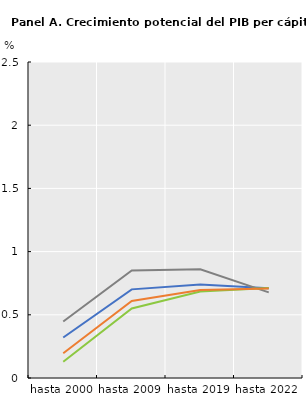
| Category | Media simple | HP | AR(1) | AR(2) |
|---|---|---|---|---|
| hasta 2000 | 0.32 | 0.447 | 0.128 | 0.196 |
| hasta 2009 | 0.701 | 0.851 | 0.55 | 0.61 |
| hasta 2019 | 0.74 | 0.86 | 0.684 | 0.695 |
| hasta 2022 | 0.71 | 0.678 | 0.712 | 0.708 |